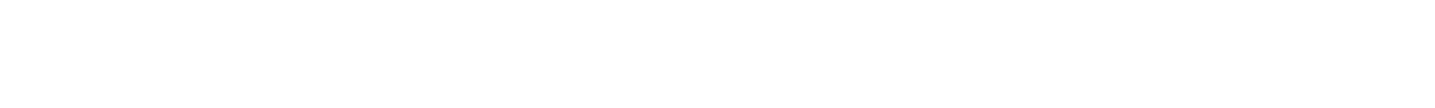
| Category | Mean (lognormal) |
|---|---|
| 0 | 1 |